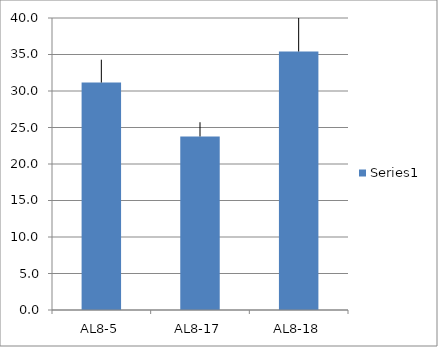
| Category | Series 0 |
|---|---|
| AL8-5 | 31.159 |
| AL8-17 | 23.774 |
| AL8-18 | 35.412 |